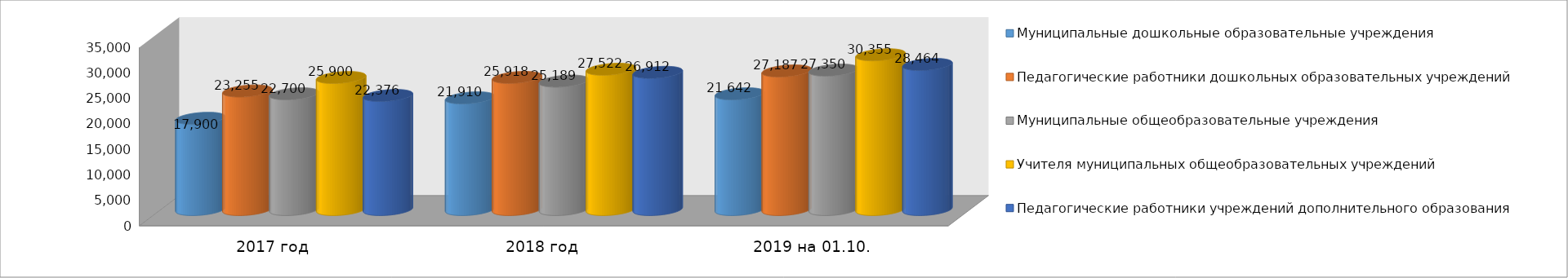
| Category | Муниципальные дошкольные образовательные учреждения | Педагогические работники дошкольных образовательных учреждений | Муниципальные общеобразовательные учреждения | Учителя муниципальных общеобразовательных учреждений | Педагогические работники учреждений дополнительного образования |
|---|---|---|---|---|---|
| 2017 год | 17900 | 23255 | 22700 | 25900 | 22376 |
| 2018 год | 21910 | 25918 | 25189 | 27522 | 26912 |
| 2019 на 01.10. | 22702 | 27187 | 27350 | 30355 | 28464 |